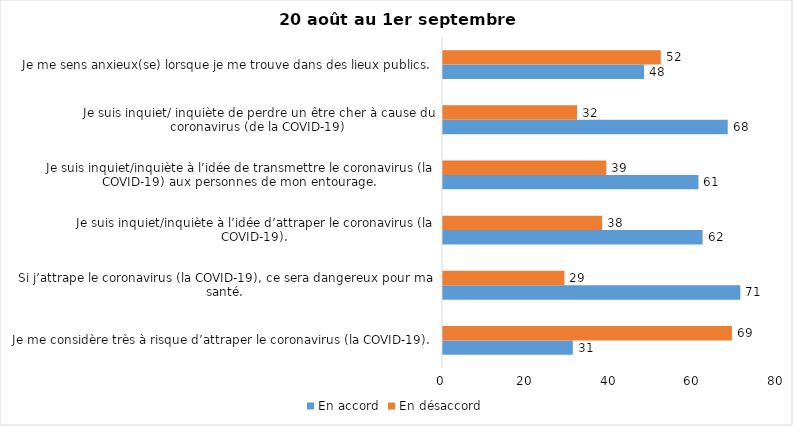
| Category | En accord | En désaccord |
|---|---|---|
| Je me considère très à risque d’attraper le coronavirus (la COVID-19). | 31 | 69 |
| Si j’attrape le coronavirus (la COVID-19), ce sera dangereux pour ma santé. | 71 | 29 |
| Je suis inquiet/inquiète à l’idée d’attraper le coronavirus (la COVID-19). | 62 | 38 |
| Je suis inquiet/inquiète à l’idée de transmettre le coronavirus (la COVID-19) aux personnes de mon entourage. | 61 | 39 |
| Je suis inquiet/ inquiète de perdre un être cher à cause du coronavirus (de la COVID-19) | 68 | 32 |
| Je me sens anxieux(se) lorsque je me trouve dans des lieux publics. | 48 | 52 |